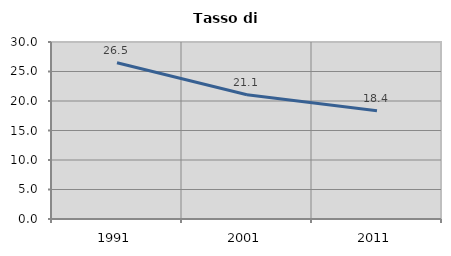
| Category | Tasso di disoccupazione   |
|---|---|
| 1991.0 | 26.485 |
| 2001.0 | 21.066 |
| 2011.0 | 18.364 |